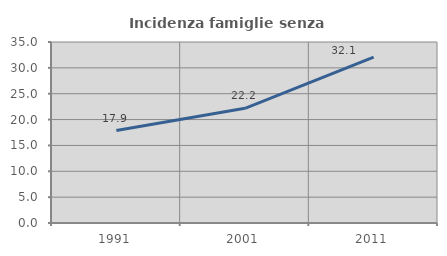
| Category | Incidenza famiglie senza nuclei |
|---|---|
| 1991.0 | 17.88 |
| 2001.0 | 22.176 |
| 2011.0 | 32.084 |